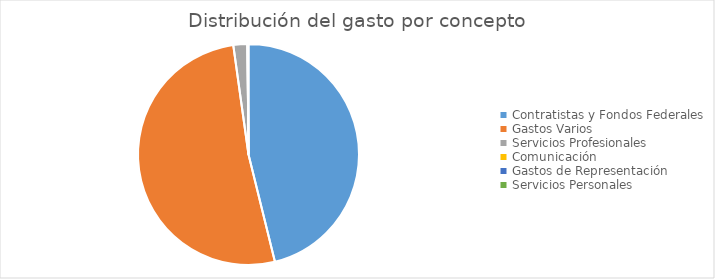
| Category | Series 0 |
|---|---|
| Contratistas y Fondos Federales | 308462950.6 |
| Gastos Varios | 345156726.6 |
| Servicios Profesionales | 13710360.6 |
| Comunicación | 0 |
| Gastos de Representación | 17847.53 |
| Servicios Personales | 996784.45 |